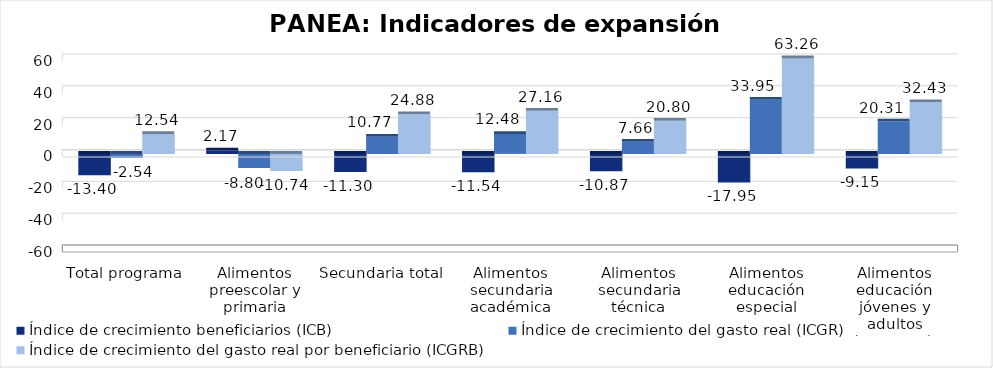
| Category | Índice de crecimiento beneficiarios (ICB)  | Índice de crecimiento del gasto real (ICGR)  | Índice de crecimiento del gasto real por beneficiario (ICGRB)  |
|---|---|---|---|
| Total programa | -13.402 | -2.542 | 12.54 |
| Alimentos preescolar y primaria | 2.174 | -8.799 | -10.74 |
| Secundaria total | -11.299 | 10.771 | 24.881 |
| Alimentos secundaria académica | -11.542 | 12.479 | 27.155 |
| Alimentos secundaria técnica | -10.871 | 7.665 | 20.797 |
| Alimentos educación especial | -17.949 | 33.955 | 63.258 |
| Alimentos educación jóvenes y adultos (nocturna)  | -9.152 | 20.313 | 32.434 |